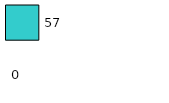
| Category | Series 0 | Series 1 |
|---|---|---|
| 0 | 0 | 57 |